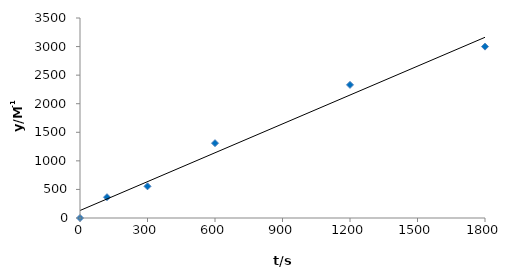
| Category | Series 0 |
|---|---|
| 0.0 | 0 |
| 120.0 | 363.528 |
| 300.0 | 554.318 |
| 600.0 | 1309.461 |
| 1200.0 | 2329.931 |
| 1800.0 | 2999.099 |